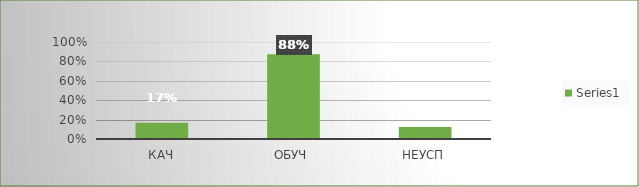
| Category | Series 0 |
|---|---|
| кач | 0.167 |
| обуч | 0.875 |
| неусп | 0.125 |